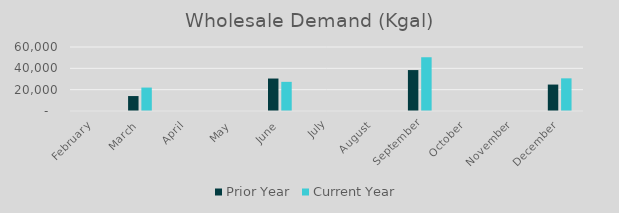
| Category | Prior Year | Current Year |
|---|---|---|
| February | 0 | 0 |
| March | 14013.78 | 21965.02 |
| April | 0 | 0 |
| May | 0 | 0 |
| June | 30443.6 | 27331 |
| July | 0 | 0 |
| August | 0 | 0 |
| September | 38376.14 | 50400.24 |
| October | 0 | 0 |
| November | 0 | 0 |
| December | 24784.98 | 30611.9 |